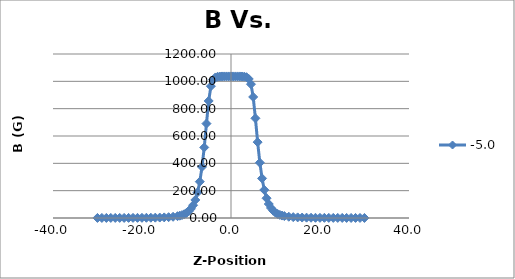
| Category | -5.0 |
|---|---|
| -30.00800000000001 | 0.45 |
| -29.01400000000001 | 0.5 |
| -28.010000000000005 | 0.5 |
| -27.010000000000005 | 0.55 |
| -26.01400000000001 | 0.55 |
| -25.012 | 0.65 |
| -24.013000000000005 | 0.75 |
| -23.012 | 0.8 |
| -22.01400000000001 | 0.951 |
| -21.01400000000001 | 1.101 |
| -20.01100000000001 | 1.351 |
| -19.012 | 1.601 |
| -18.01400000000001 | 1.951 |
| -17.013000000000005 | 2.502 |
| -16.01100000000001 | 3.252 |
| -15.01100000000001 | 4.403 |
| -14.015 | 6.054 |
| -13.013000000000005 | 8.805 |
| -12.012 | 13.308 |
| -11.515 | 16.71 |
| -11.013000000000005 | 21.363 |
| -10.512 | 27.767 |
| -10.015 | 36.522 |
| -9.512 | 49.18 |
| -9.015 | 67.191 |
| -8.515 | 93.457 |
| -8.013000000000005 | 132.031 |
| -7.515000000000001 | 187.265 |
| -7.013000000000005 | 265.913 |
| -6.51400000000001 | 373.579 |
| -6.016000000000005 | 516.216 |
| -5.513000000000005 | 690.673 |
| -5.015000000000001 | 856.374 |
| -4.51400000000001 | 964.441 |
| -4.013000000000005 | 1012.02 |
| -3.5150000000000006 | 1028.38 |
| -3.01100000000001 | 1033.583 |
| -2.5130000000000052 | 1035.234 |
| -2.01400000000001 | 1035.784 |
| -1.5120000000000005 | 1035.884 |
| -1.01400000000001 | 1035.884 |
| -0.5130000000000052 | 1035.884 |
| -0.012000000000000455 | 1035.934 |
| 0.48499999999999943 | 1035.934 |
| 0.9869999999999948 | 1035.884 |
| 1.48599999999999 | 1035.884 |
| 1.98599999999999 | 1035.784 |
| 2.4879999999999995 | 1035.434 |
| 2.9849999999999994 | 1034.183 |
| 3.48599999999999 | 1030.131 |
| 3.98599999999999 | 1017.173 |
| 4.483999999999995 | 979 |
| 4.986999999999995 | 885.642 |
| 5.48599999999999 | 729.497 |
| 5.983999999999995 | 555.09 |
| 6.484999999999999 | 404.598 |
| 6.984999999999999 | 289.928 |
| 7.483999999999995 | 205.376 |
| 7.98599999999999 | 144.639 |
| 8.483999999999995 | 102.413 |
| 8.985 | 73.295 |
| 9.485 | 53.233 |
| 9.98299999999999 | 39.424 |
| 10.48599999999999 | 29.568 |
| 10.985 | 22.714 |
| 11.48299999999999 | 17.811 |
| 11.985 | 14.009 |
| 12.985 | 9.206 |
| 13.982 | 6.254 |
| 14.98299999999999 | 4.453 |
| 15.98599999999999 | 3.302 |
| 16.985 | 2.452 |
| 17.98299999999999 | 1.951 |
| 18.98299999999999 | 1.551 |
| 19.98599999999999 | 1.301 |
| 20.985 | 1.151 |
| 21.98299999999999 | 0.851 |
| 22.983999999999995 | 0.75 |
| 23.98599999999999 | 0.6 |
| 24.98599999999999 | 0.55 |
| 25.983000000000004 | 0.5 |
| 26.984999999999985 | 0.45 |
| 27.98599999999999 | 0.4 |
| 28.98599999999999 | 0.35 |
| 29.98399999999998 | 0.35 |